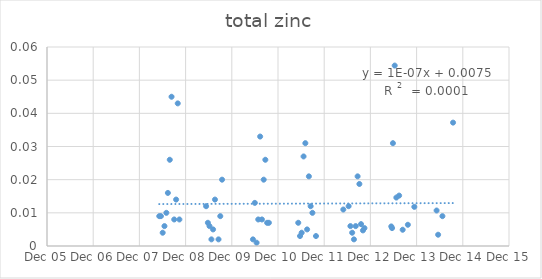
| Category | Series 0 |
|---|---|
| 39577.0 | 0.009 |
| 39590.0 | 0.009 |
| 39604.0 | 0.004 |
| 39618.0 | 0.006 |
| 39633.0 | 0.01 |
| 39645.0 | 0.016 |
| 39660.0 | 0.026 |
| 39674.0 | 0.045 |
| 39695.0 | 0.008 |
| 39710.0 | 0.014 |
| 39723.0 | 0.043 |
| 39736.0 | 0.008 |
| 39947.0 | 0.012 |
| 39961.0 | 0.007 |
| 39974.0 | 0.006 |
| 39989.0 | 0.002 |
| 40002.0 | 0.005 |
| 40017.0 | 0.014 |
| 40045.0 | 0.002 |
| 40059.0 | 0.009 |
| 40073.0 | 0.02 |
| 40317.0 | 0.002 |
| 40332.0 | 0.013 |
| 40346.0 | 0.001 |
| 40359.0 | 0.008 |
| 40374.0 | 0.033 |
| 40388.0 | 0.008 |
| 40402.0 | 0.02 |
| 40415.0 | 0.026 |
| 40429.0 | 0.007 |
| 40443.0 | 0.007 |
| 40675.0 | 0.007 |
| 40689.0 | 0.003 |
| 40702.0 | 0.004 |
| 40717.0 | 0.027 |
| 40731.0 | 0.031 |
| 40745.0 | 0.005 |
| 40759.0 | 0.021 |
| 40773.0 | 0.012 |
| 40787.0 | 0.01 |
| 40815.0 | 0.003 |
| 41031.0 | 0.011 |
| 41073.0 | 0.012 |
| 41087.0 | 0.006 |
| 41101.0 | 0.004 |
| 41115.0 | 0.002 |
| 41129.0 | 0.006 |
| 41144.0 | 0.021 |
| 41158.0 | 0.019 |
| 41171.0 | 0.007 |
| 41186.0 | 0.005 |
| 41198.0 | 0.005 |
| 41410.0 | 0.006 |
| 41416.0 | 0.005 |
| 41423.0 | 0.031 |
| 41437.0 | 0.054 |
| 41450.0 | 0.015 |
| 41472.0 | 0.015 |
| 41500.0 | 0.005 |
| 41541.0 | 0.006 |
| 41592.0 | 0.012 |
| 41768.0 | 0.011 |
| 41780.0 | 0.003 |
| 41814.0 | 0.009 |
| 41898.0 | 0.037 |